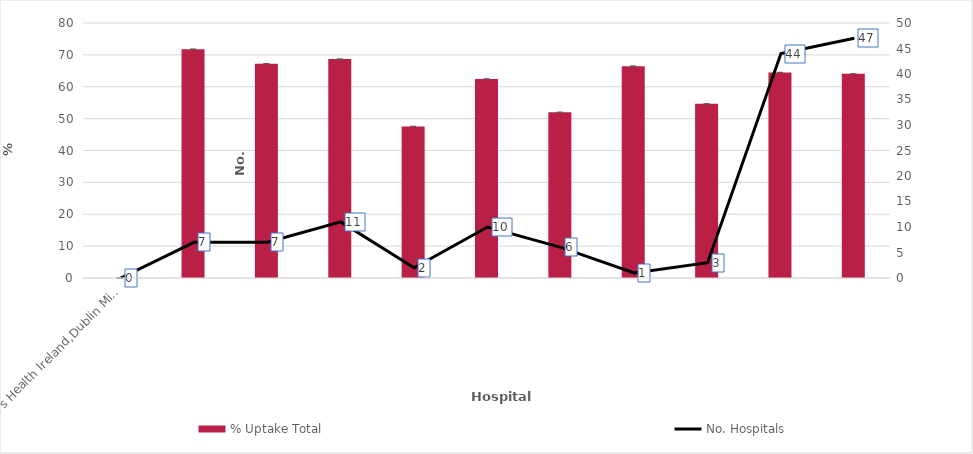
| Category | % Uptake Total  |
|---|---|
| 0 | 0 |
| 1 | 71.787 |
| 2 | 67.246 |
| 3 | 68.678 |
| 4 | 47.561 |
| 5 | 62.46 |
| 6 | 52.003 |
| 7 | 66.467 |
| 8 | 54.642 |
| 9 | 64.508 |
| 10 | 64.05 |